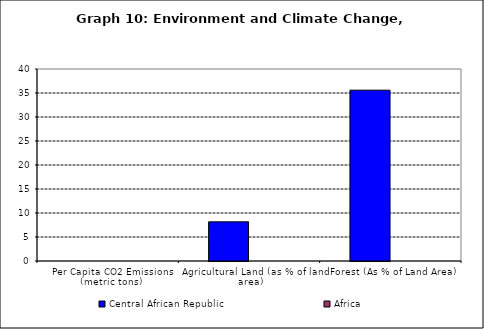
| Category | Central African Republic | Africa |
|---|---|---|
| Per Capita CO2 Emissions (metric tons) | 0 | 0 |
| Agricultural Land (as % of land area) | 8.154 | 0 |
| Forest (As % of Land Area) | 35.587 | 0 |